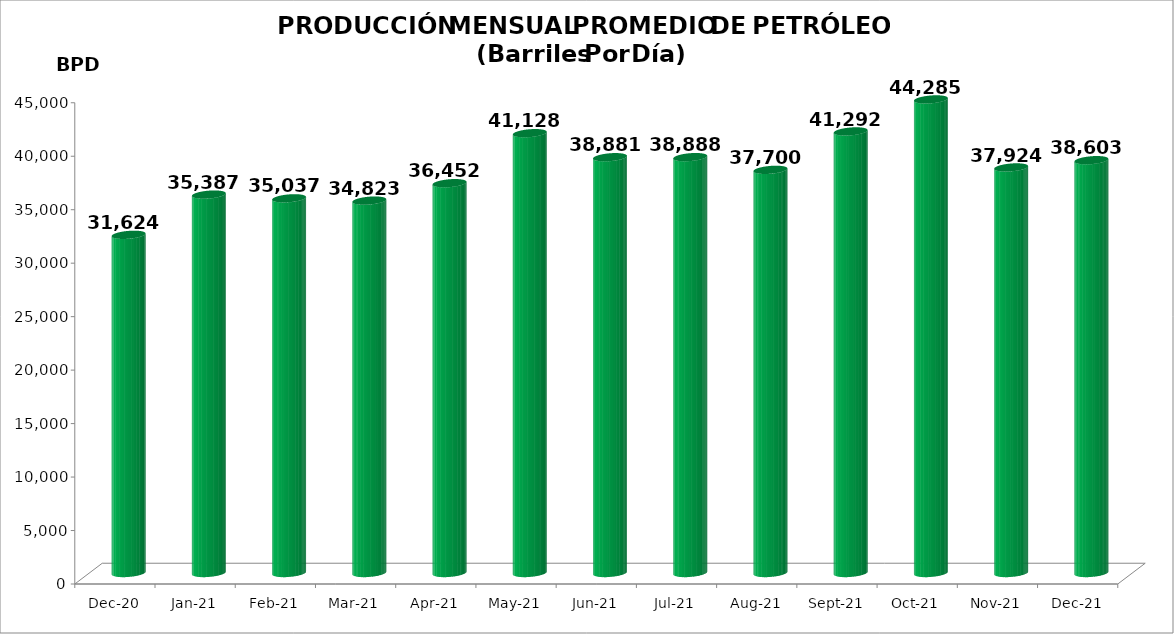
| Category | Series 0 |
|---|---|
| 2020-12-01 | 31624 |
| 2021-01-01 | 35387 |
| 2021-02-01 | 35037 |
| 2021-03-01 | 34823 |
| 2021-04-01 | 36452 |
| 2021-05-01 | 41128.032 |
| 2021-06-01 | 38881.4 |
| 2021-07-01 | 38887.645 |
| 2021-08-01 | 37699.645 |
| 2021-09-01 | 41292 |
| 2021-10-01 | 44285 |
| 2021-11-01 | 37924 |
| 2021-12-01 | 38603 |